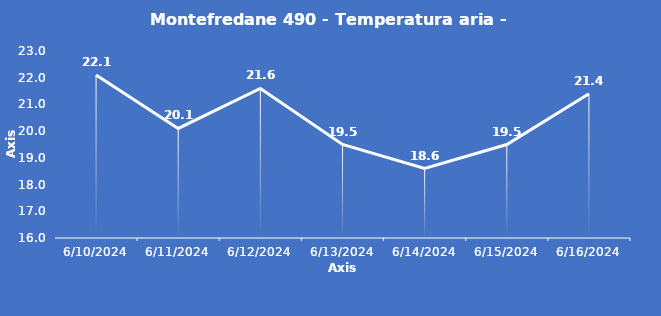
| Category | Montefredane 490 - Temperatura aria - Grezzo (°C) |
|---|---|
| 6/10/24 | 22.1 |
| 6/11/24 | 20.1 |
| 6/12/24 | 21.6 |
| 6/13/24 | 19.5 |
| 6/14/24 | 18.6 |
| 6/15/24 | 19.5 |
| 6/16/24 | 21.4 |